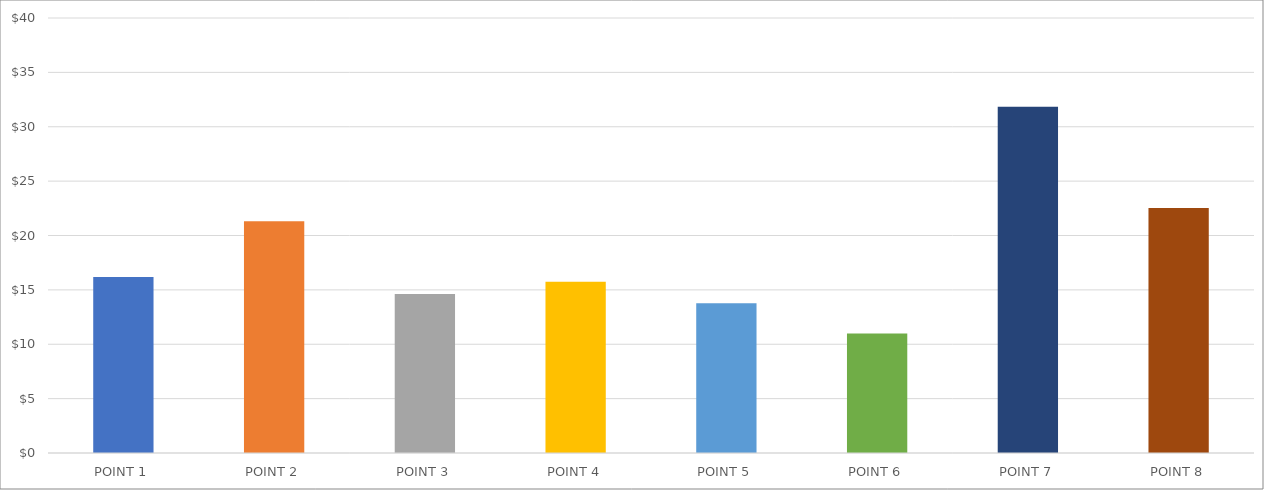
| Category | BÉNÉFICE PAR ARTICLE |
|---|---|
| POINT 1 | 16.185 |
| POINT 2 | 21.315 |
| POINT 3 | 14.625 |
| POINT 4 | 15.75 |
| POINT 5 | 13.775 |
| POINT 6 | 11 |
| POINT 7 | 31.85 |
| POINT 8 | 22.54 |